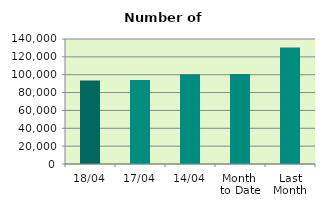
| Category | Series 0 |
|---|---|
| 18/04 | 93596 |
| 17/04 | 94052 |
| 14/04 | 100536 |
| Month 
to Date | 100922.6 |
| Last
Month | 130565.565 |